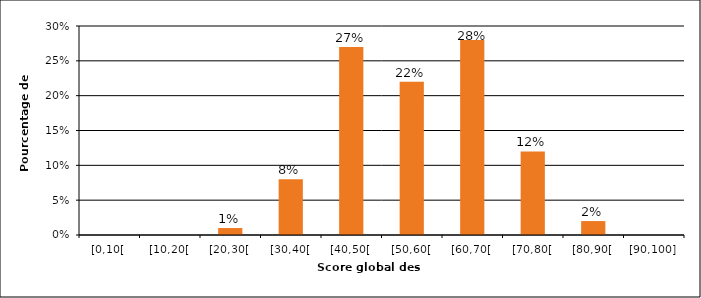
| Category | Series 0 | Series 1 |
|---|---|---|
| [0,10[ |  | 0 |
| [10,20[ |  | 0 |
| [20,30[ |  | 0.01 |
| [30,40[ |  | 0.08 |
| [40,50[ |  | 0.27 |
| [50,60[ |  | 0.22 |
| [60,70[ |  | 0.28 |
| [70,80[ |  | 0.12 |
| [80,90[ |  | 0.02 |
| [90,100] |  | 0 |